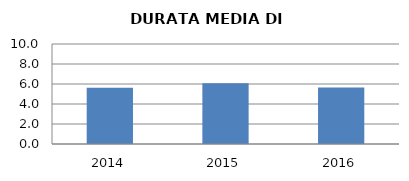
| Category | 2014 2015 2016 |
|---|---|
| 2014.0 | 5.634 |
| 2015.0 | 6.071 |
| 2016.0 | 5.649 |